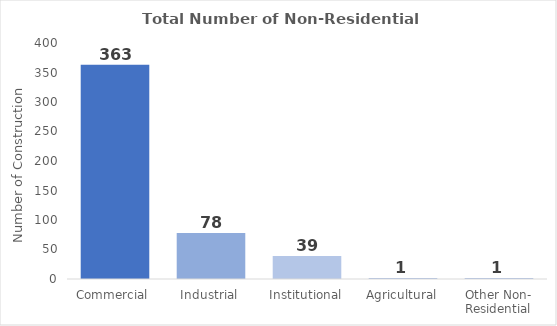
| Category | No |
|---|---|
| Commercial | 363 |
| Industrial | 78 |
| Institutional | 39 |
| Agricultural | 1 |
| Other Non- Residential | 1 |